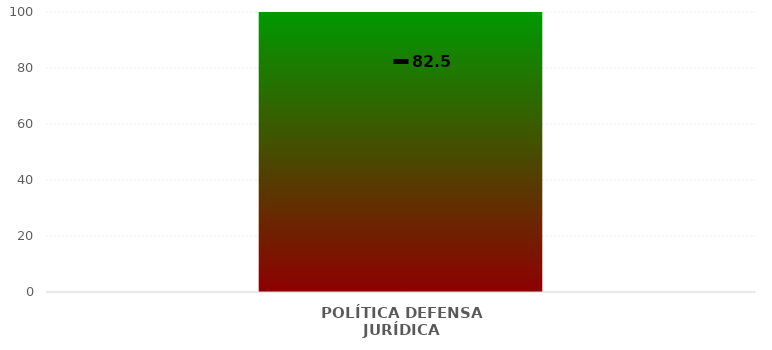
| Category | Niveles |
|---|---|
| POLÍTICA DEFENSA JURÍDICA | 100 |